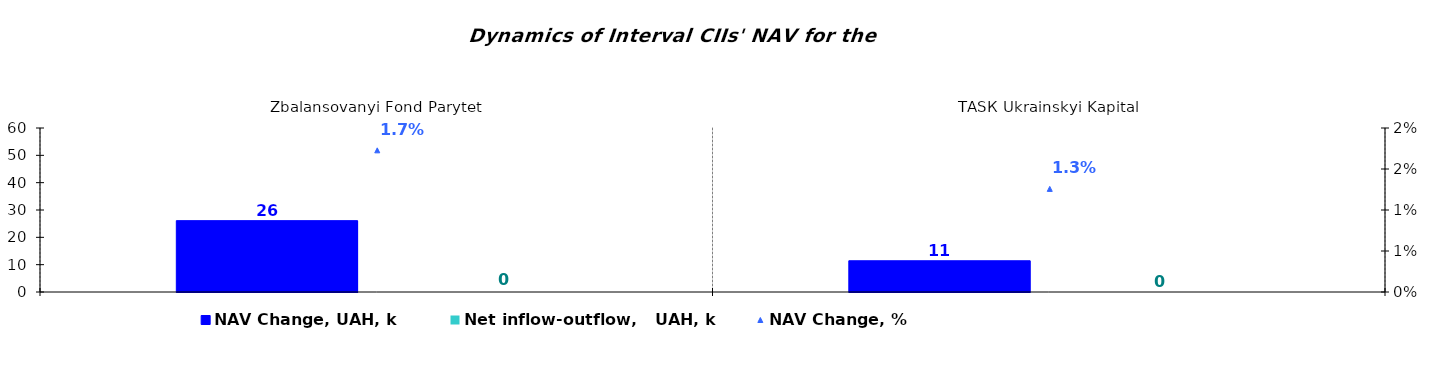
| Category | NAV Change, UAH, k | Net inflow-outflow,   UAH, k |
|---|---|---|
| Zbalansovanyi Fond Parytet | 26.102 | 0 |
| ТАSК Ukrainskyi Kapital | 11.432 | 0 |